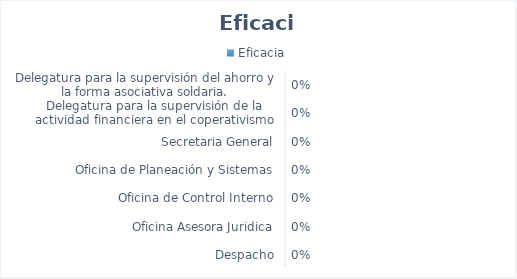
| Category | Eficacia |
|---|---|
| Despacho | 0 |
| Oficina Asesora Juridica | 0 |
| Oficina de Control Interno | 0 |
| Oficina de Planeación y Sistemas | 0 |
| Secretaria General | 0 |
| Delegatura para la supervisión de la actividad financiera en el coperativismo | 0 |
| Delegatura para la supervisión del ahorro y la forma asociativa soldaria. | 0 |